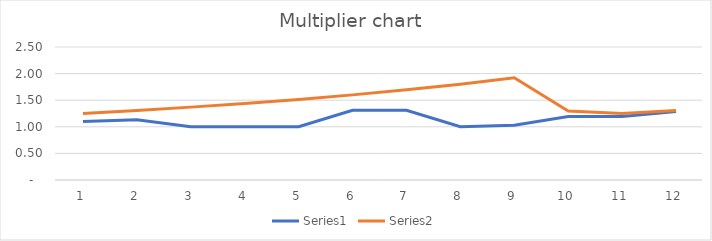
| Category | Series 0 | Series 1 |
|---|---|---|
| 0 | 1.098 | 1.25 |
| 1 | 1.135 | 1.307 |
| 2 | 1 | 1.37 |
| 3 | 1 | 1.439 |
| 4 | 1 | 1.515 |
| 5 | 1.311 | 1.6 |
| 6 | 1.311 | 1.695 |
| 7 | 1 | 1.802 |
| 8 | 1.031 | 1.923 |
| 9 | 1.193 | 1.299 |
| 10 | 1.193 | 1.25 |
| 11 | 1.289 | 1.307 |